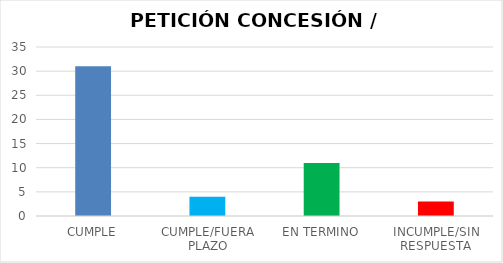
| Category | TOTAL |
|---|---|
| CUMPLE | 31 |
| CUMPLE/FUERA PLAZO | 4 |
| EN TERMINO | 11 |
| INCUMPLE/SIN RESPUESTA | 3 |